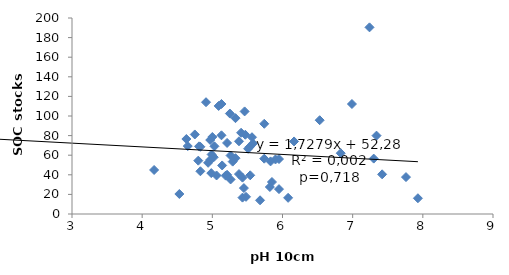
| Category | 48 |
|---|---|
| 7.24 | 190.46 |
| 5.33 | 97.771 |
| 7.3 | 56.529 |
| 4.91 | 114.064 |
| 5.09 | 110.272 |
| 5.13 | 112.266 |
| 5.38 | 74.214 |
| 4.97 | 75.493 |
| 6.53 | 95.696 |
| 7.34 | 79.973 |
| 5.9 | 55.647 |
| 6.83 | 62.035 |
| 6.99 | 112.24 |
| 5.43 | 37.113 |
| 5.45 | 26.448 |
| 7.93 | 16.075 |
| 5.85 | 32.652 |
| 6.08 | 16.496 |
| 5.74 | 56.442 |
| 4.65 | 69.311 |
| 5.13 | 80.297 |
| 4.99 | 60.733 |
| 5.68 | 13.992 |
| 5.48 | 17.528 |
| 5.74 | 92.069 |
| 5.47 | 80.895 |
| 5.95 | 56.097 |
| 5.41 | 82.906 |
| 5.58 | 72.052 |
| 5.46 | 104.687 |
| nan | 140.163 |
| 5.06 | 39.318 |
| 5.26 | 59.683 |
| 5.21 | 72.512 |
| 4.83 | 68.582 |
| 5.0 | 78.58 |
| 5.83 | 53.682 |
| 4.8 | 54.422 |
| 4.75 | 81.16 |
| 4.53 | 20.421 |
| 5.26 | 35.267 |
| 4.83 | 43.593 |
| 5.02 | 57.927 |
| 4.97 | 55.231 |
| 4.17 | 44.926 |
| 4.94 | 52.242 |
| 5.19 | 39.147 |
| 5.21 | 40.002 |
| 5.33 | 56.941 |
| 4.63 | 76.522 |
| nan | 69.15 |
| 5.82 | 27.54 |
| 5.54 | 39.485 |
| 4.81 | 69.032 |
| 5.38 | 40.753 |
| 5.14 | 49.552 |
| 5.51 | 66.581 |
| 5.29 | 53.448 |
| 7.42 | 40.473 |
| 7.76 | 37.674 |
| 5.95 | 25.393 |
| 5.43 | 16.724 |
| 6.165 | 74.03 |
| 5.25 | 102.5 |
| 5.5649999999999995 | 78.348 |
| 4.984999999999999 | 41.735 |
| 5.029999999999999 | 69.083 |
| 5.535 | 68.553 |